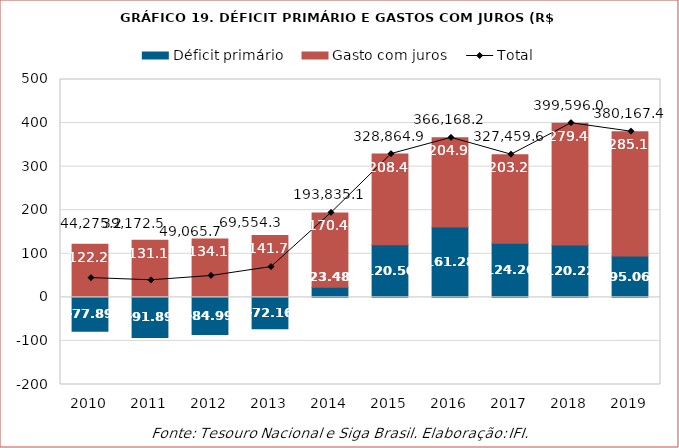
| Category | Déficit primário | Gasto com juros |
|---|---|---|
| 2010.0 | -77891.169 | 122166.387 |
| 2011.0 | -91891.031 | 131063.49 |
| 2012.0 | -84987.966 | 134053.709 |
| 2013.0 | -72159.145 | 141713.415 |
| 2014.0 | 23482.403 | 170352.743 |
| 2015.0 | 120502.227 | 208362.68 |
| 2016.0 | 161275.625 | 204892.608 |
| 2017.0 | 124261.487 | 203198.132 |
| 2018.0 | 120221.282 | 279374.714 |
| 2019.0 | 95064.747 | 285102.612 |